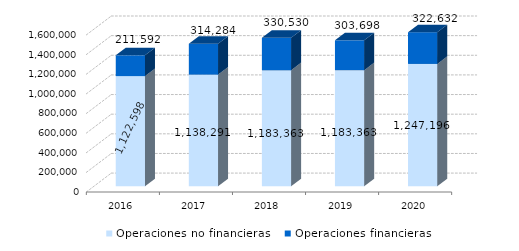
| Category | Operaciones no financieras | Operaciones financieras |
|---|---|---|
| 2016.0 | 1122597.53 | 211592.47 |
| 2017.0 | 1138290.67 | 314284.33 |
| 2018.0 | 1183363 | 330530 |
| 2019.0 | 1183362.8 | 303698.48 |
| 2020.0 | 1247196 | 322632.12 |